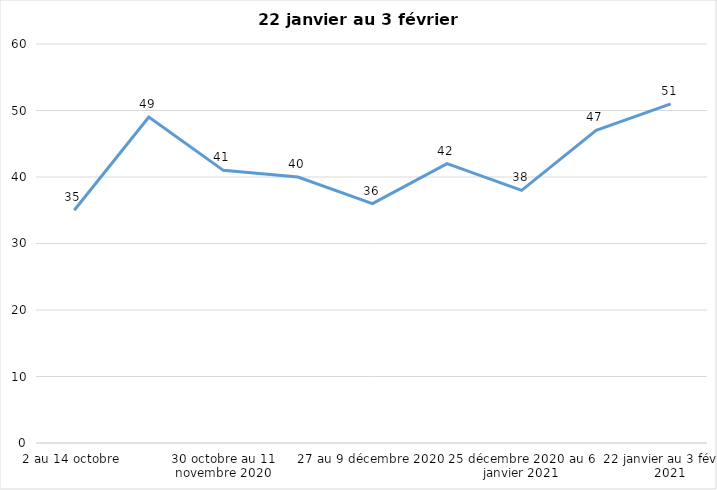
| Category | Toujours aux trois mesures |
|---|---|
| 2 au 14 octobre  | 35 |
| 16 au 28 octobre 2020 | 49 |
| 30 octobre au 11 novembre 2020 | 41 |
| 13 au 25 novembre 2020 | 40 |
| 27 au 9 décembre 2020 | 36 |
| 11 au 25 décembre 2020 | 42 |
| 25 décembre 2020 au 6 janvier 2021 | 38 |
| 8 au 20 janvier 2021 | 47 |
| 22 janvier au 3 février 2021 | 51 |